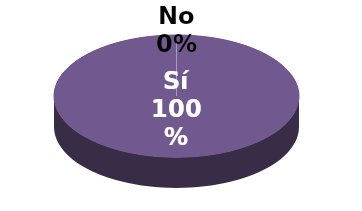
| Category | Series 1 |
|---|---|
| Sí | 14 |
| No | 0 |